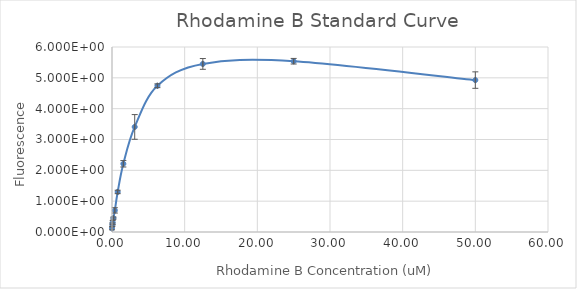
| Category | Series 0 |
|---|---|
| 50.0 | 4.927 |
| 25.0 | 5.539 |
| 12.5 | 5.451 |
| 6.25 | 4.744 |
| 3.125 | 3.408 |
| 1.5625 | 2.213 |
| 0.78125 | 1.299 |
| 0.390625 | 0.701 |
| 0.1953125 | 0.45 |
| 0.09765625 | 0.306 |
| 0.048828125 | 0.236 |
| 0.0 | 0.119 |